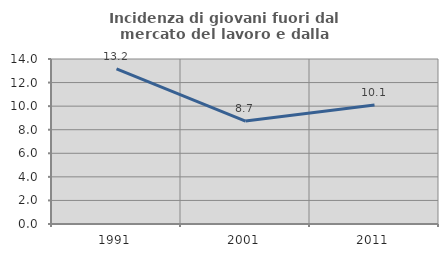
| Category | Incidenza di giovani fuori dal mercato del lavoro e dalla formazione  |
|---|---|
| 1991.0 | 13.155 |
| 2001.0 | 8.732 |
| 2011.0 | 10.092 |